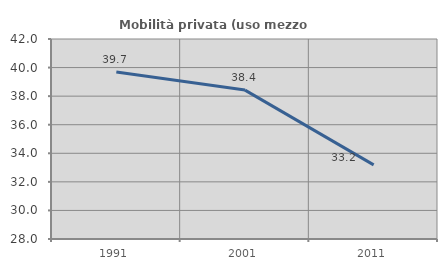
| Category | Mobilità privata (uso mezzo privato) |
|---|---|
| 1991.0 | 39.696 |
| 2001.0 | 38.422 |
| 2011.0 | 33.192 |